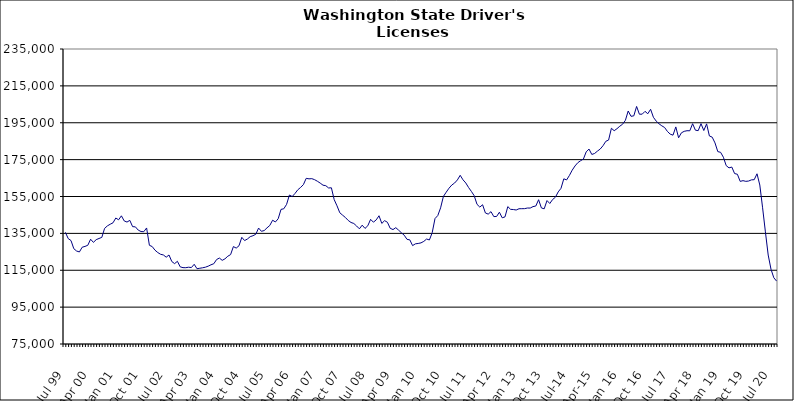
| Category | Series 0 |
|---|---|
| Jul 99 | 135560 |
| Aug 99 | 132182 |
| Sep 99 | 131104 |
| Oct 99 | 126694 |
| Nov 99 | 125425 |
| Dec 99 | 124927 |
| Jan 00 | 127499 |
| Feb 00 | 127927 |
| Mar 00 | 128547 |
| Apr 00 | 131834 |
| May 00 | 130120 |
| Jun 00 | 131595 |
| Jul 00 | 132236 |
| Aug 00 | 132819 |
| Sep 00 | 137711 |
| Oct 00 | 139063 |
| Nov 00 | 139952 |
| Dec 00 | 140732 |
| Jan 01 | 143338 |
| Feb 01 | 142359 |
| Mar 01 | 144523 |
| Apr 01 | 141758 |
| May 01 | 141135 |
| Jun 01 | 142064 |
| Jul 01 | 138646 |
| Aug 01 | 138530 |
| Sep 01 | 136784 |
| Oct 01 | 135996 |
| Nov 01 | 135917 |
| Dec 01 | 137940 |
| Jan 02 | 128531 |
| Feb 02 | 127848 |
| Mar 02 | 125876 |
| Apr 02 | 124595 |
| May 02 | 123660 |
| Jun 02 | 123282 |
| Jul 02 | 122089 |
| Aug 02 | 123279 |
| Sep 02 | 119727 |
| Oct 02 | 118588 |
| Nov 02 | 119854 |
| Dec 02 | 116851 |
| Jan 03 | 116407 |
| Feb 03 | 116382 |
| Mar 03 | 116648 |
| Apr 03 | 116471 |
| May 03 | 118231 |
| Jun 03 | 115831 |
| Jul 03 | 116082 |
| Aug 03 | 116341 |
| Sep 03 | 116653 |
| Oct 03 | 117212 |
| Nov 03 | 117962 |
| Dec 03 | 118542 |
| Jan 04 | 120817 |
| Feb 04 | 121617 |
| Mar 04 | 120369 |
| Apr 04 | 121200 |
| May 04 | 122609 |
| Jun 04 | 123484 |
| Jul 04 | 127844 |
| Aug 04 | 127025 |
| Sep 04 | 128273 |
| Oct 04 | 132853 |
| Nov 04 | 131106 |
| Dec 04 | 131935 |
| Jan 05 | 133205 |
| Feb 05 | 133736 |
| Mar 05 | 134528 |
| Apr 05 | 137889 |
| May 05 | 136130 |
| Jun 05 | 136523 |
| Jul 05 | 137997 |
| Aug 05 | 139294 |
| Sep 05 | 142140 |
| Oct 05 | 141192 |
| Nov 05 | 142937 |
| Dec 05 | 148013 |
| Jan 06 | 148341 |
| Feb 06 | 150744 |
| Mar 06 | 155794 |
| Apr 06 | 154984 |
| May 06 | 156651 |
| Jun 06 | 158638 |
| Jul 06 | 159911 |
| Aug 06 | 161445 |
| Sep 06 | 164852 |
| Oct 06 | 164570 |
| Nov 06 | 164679 |
| Dec 06 | 164127 |
| Jan 07 | 163271 |
| Feb 07 | 162273 |
| Mar 07 | 161140 |
| Apr 07 | 160860 |
| May 07 | 159633 |
| Jun 07 | 159724 |
| Jul 07 | 153303 |
| Aug 07 | 149939 |
| Sep 07 | 146172 |
| Oct 07 | 144876 |
| Nov 07 | 143613 |
| Dec 07 | 142022 |
| Jan 08 | 140909 |
| Feb 08 | 140368 |
| Mar 08 | 138998 |
| Apr 08 | 137471 |
| May 08 | 139453 |
| Jun 08 | 137680 |
| Jul 08 | 139120 |
| Aug 08 | 142612 |
| Sep-08 | 141071 |
| Oct 08 | 142313 |
| Nov 08 | 144556 |
| Dec 08 | 140394 |
| Jan 09 | 141903 |
| Feb 09 | 141036 |
| Mar 09 | 137751 |
| Apr 09 | 137060 |
| May 09 | 138101 |
| Jun 09 | 136739 |
| Jul 09 | 135317 |
| Aug 09 | 134020 |
| Sep 09 | 131756 |
| Oct 09 | 131488 |
| Nov 09 | 128370 |
| Dec 09 | 129323 |
| Jan 10 | 129531 |
| Feb 10 | 129848 |
| Mar 10 | 130654 |
| Apr 10 | 131929 |
| May 10 | 131429 |
| Jun 10 | 135357 |
| Jul 10 | 143032 |
| Aug 10 | 144686 |
| Sep 10 | 148856 |
| Oct 10 | 155042 |
| Nov 10 | 157328 |
| Dec 10 | 159501 |
| Jan 11 | 161221 |
| Feb 11 | 162312 |
| Mar 11 | 163996 |
| Apr 11 | 166495 |
| May 11 | 164040 |
| Jun 11 | 162324 |
| Jul 11 | 159862 |
| Aug 11 | 157738 |
| Sep 11 | 155430 |
| Oct 11 | 150762 |
| Nov 11 | 149255 |
| Dec 11 | 150533 |
| Jan 12 | 146068 |
| Feb 12 | 145446 |
| Mar 12 | 146788 |
| Apr 12 | 144110 |
| May 12 | 144162 |
| Jun 12 | 146482 |
| Jul 12 | 143445 |
| Aug 12 | 143950 |
| Sep 12 | 149520 |
| Oct 12 | 148033 |
| Nov 12 | 147926 |
| Dec 12 | 147674 |
| Jan 13 | 148360 |
| Feb-13 | 148388 |
| Mar-13 | 148414 |
| Apr 13 | 148749 |
| May 13 | 148735 |
| Jun-13 | 149521 |
| Jul 13 | 149837 |
| Aug 13 | 153252 |
| Sep 13 | 148803 |
| Oct 13 | 148315 |
| Nov 13 | 152804 |
| Dec 13 | 151209 |
| Jan 14 | 153357 |
| Feb-14 | 154608 |
| Mar 14 | 157479 |
| Apr 14 | 159441 |
| May 14 | 164591 |
| Jun 14 | 163995 |
| Jul-14 | 166411 |
| Aug-14 | 169272 |
| Sep 14 | 171565 |
| Oct 14 | 173335 |
| Nov 14 | 174406 |
| Dec 14 | 175302 |
| Jan 15 | 179204 |
| Feb 15 | 180737 |
| Mar 15 | 177810 |
| Apr-15 | 178331 |
| May 15 | 179601 |
| Jun-15 | 180729 |
| Jul 15 | 182540 |
| Aug 15 | 184924 |
| Sep 15 | 185620 |
| Oct 15 | 192002 |
| Nov 15 | 190681 |
| Dec 15 | 191795 |
| Jan 16 | 193132 |
| Feb 16 | 194206 |
| Mar 16 | 196319 |
| Apr 16 | 201373 |
| May 16 | 198500 |
| Jun 16 | 198743 |
| Jul 16 | 203841 |
| Aug 16 | 199630 |
| Sep 16 | 199655 |
| Oct 16 | 201181 |
| Nov 16 | 199888 |
| Dec 16 | 202304 |
| Jan 17 | 197977 |
| Feb 17 | 195889 |
| Mar 17 | 194438 |
| Apr 17 | 193335 |
| May 17 | 192430 |
| Jun 17 | 190298 |
| Jul 17 | 188832 |
| Aug 17 | 188264 |
| Sep 17 | 192738 |
| Oct 17 | 186856 |
| Nov 17 | 189537 |
| Dec 17 | 190341 |
| Jan 18 | 190670 |
| Feb 18 | 190645 |
| Mar 18 | 194476 |
| Apr 18 | 190971 |
| May 18 | 190707 |
| Jun 18 | 194516 |
| Jul 18 | 190783 |
| Aug 18 | 194390 |
| Sep 18 | 187831 |
| Oct 18 | 187188 |
| Nov 18 | 184054 |
| Dec 18 | 179347 |
| Jan 19 | 178958 |
| Feb 19 | 176289 |
| Mar 19 | 171747 |
| Apr 19 | 170532 |
| May 19 | 170967 |
| Jun 19 | 167444 |
| Jul 19 | 167059 |
| Aug 19 | 163194 |
| Sep 19 | 163599 |
| Oct 19 | 163212 |
| Nov 19 | 163388 |
| Dec 19 | 164024 |
| Jan 20 | 164114 |
| Feb 20 | 167320 |
| Mar 20 | 161221 |
| Apr 20 | 148866 |
| May 20 | 135821 |
| Jun 20 | 123252 |
| Jul 20 | 115526 |
| Aug 20 | 110940 |
| Sep 20 | 109099 |